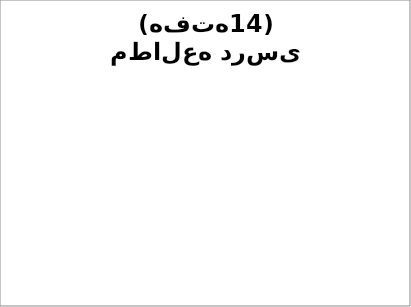
| Category | نمودار مطالعه درسی |
|---|---|
| زبان | 0 |
| ریاضی | 0 |
| آمار | 0 |
| تحقیق | 0 |
| اقتصاد | 0 |
| مدیریت | 0 |